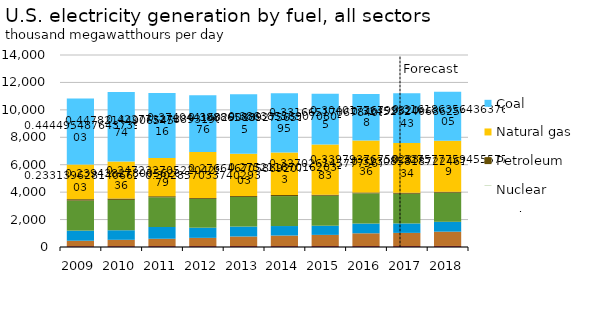
| Category | Other sources | renewables | Non-hydro | Hydropower | Nuclear | Petroleum | Natural gas | Coal |
|---|---|---|---|---|---|---|---|---|
| 2009.0 | 61.809 | 395.284 |  | 736.487 | 2188.643 | 106.675 | 2523.229 | 4810.697 |
| 2010.0 | 66.214 | 458.008 |  | 697.814 | 2210.872 | 101.537 | 2706.02 | 5061.069 |
| 2011.0 | 70.465 | 531.455 |  | 857.354 | 2164.943 | 82.691 | 2777.23 | 4749.123 |
| 2012.0 | 70.177 | 596.538 |  | 741.229 | 2101.998 | 63.359 | 3349.438 | 4136.729 |
| 2013.0 | 72.44 | 694.543 |  | 722.971 | 2161.689 | 74.423 | 3081.741 | 4331.821 |
| 2014.0 | 69.817 | 764.966 |  | 693.68 | 2184.016 | 82.827 | 3086.6 | 4333.453 |
| 2015.0 | 74.368 | 808.66 |  | 668.462 | 2184.049 | 77.394 | 3653.376 | 3705.201 |
| 2016.0 | 73.489 | 926.062 |  | 710.092 | 2200.429 | 64.598 | 3791.723 | 3392.502 |
| 2017.0 | 74.702 | 954.955 |  | 688.405 | 2163.505 | 70.542 | 3623.448 | 3639.568 |
| 2018.0 | 75.565 | 1043.412 |  | 717.844 | 2122.973 | 72.636 | 3708.033 | 3579.088 |